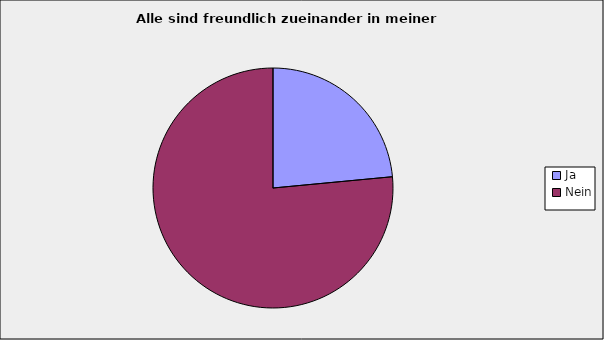
| Category | Series 0 |
|---|---|
| Ja | 0.235 |
| Nein | 0.765 |